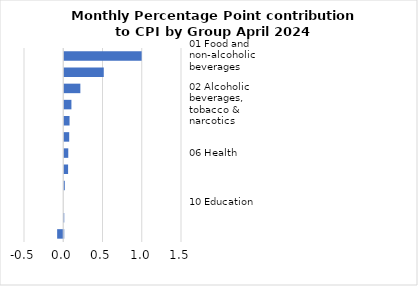
| Category |     Contributions |
|---|---|
| 01 Food and non-alcoholic beverages | 0.986 |
| 07 Transport | 0.503 |
| 05 Furnishings, household equipment & maintenance | 0.205 |
| 02 Alcoholic beverages, tobacco & narcotics | 0.091 |
| 08 Communication | 0.068 |
| 12 Miscellaneous goods & services | 0.063 |
| 06 Health | 0.051 |
| 11 Restaurants and hotels | 0.049 |
| 09 Recreation and culture | 0.007 |
| 10 Education | 0 |
| 03 Clothing and footwear | -0.003 |
| 04 Housing, water, electricity, gas & other fuels | -0.078 |